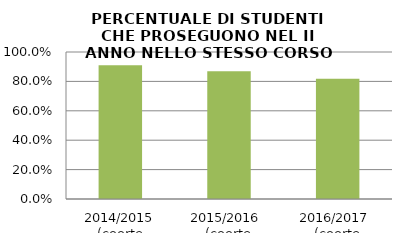
| Category | 2014/2015 (coorte 2013/14) 2015/2016  (coorte 2014/15) 2016/2017  (coorte 2015/16) |
|---|---|
| 2014/2015 (coorte 2013/14) | 0.909 |
| 2015/2016  (coorte 2014/15) | 0.87 |
| 2016/2017  (coorte 2015/16) | 0.818 |